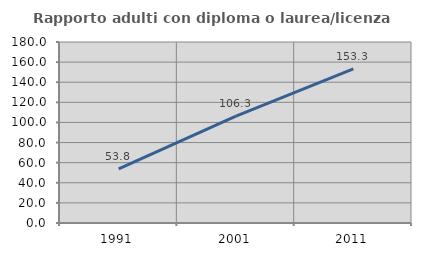
| Category | Rapporto adulti con diploma o laurea/licenza media  |
|---|---|
| 1991.0 | 53.846 |
| 2001.0 | 106.25 |
| 2011.0 | 153.333 |